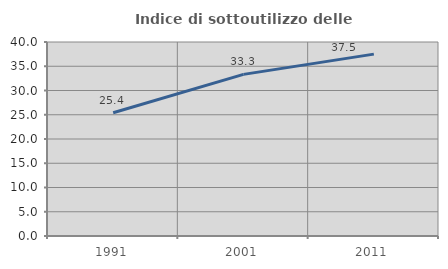
| Category | Indice di sottoutilizzo delle abitazioni  |
|---|---|
| 1991.0 | 25.417 |
| 2001.0 | 33.322 |
| 2011.0 | 37.5 |